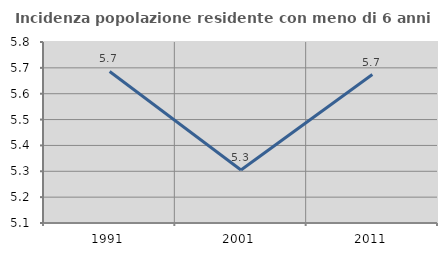
| Category | Incidenza popolazione residente con meno di 6 anni |
|---|---|
| 1991.0 | 5.686 |
| 2001.0 | 5.305 |
| 2011.0 | 5.674 |